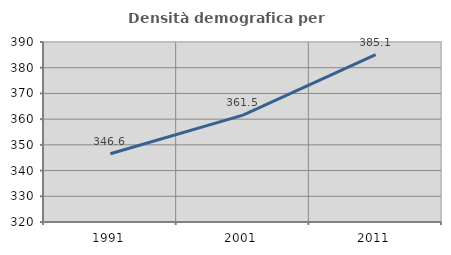
| Category | Densità demografica |
|---|---|
| 1991.0 | 346.55 |
| 2001.0 | 361.542 |
| 2011.0 | 385.056 |